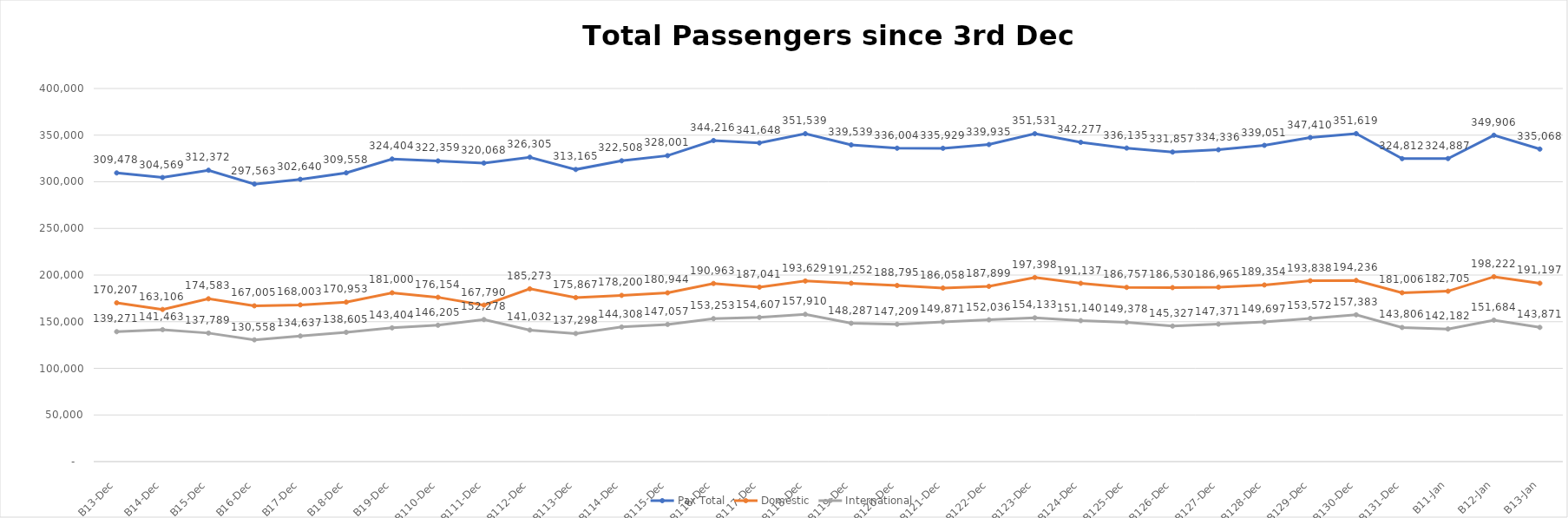
| Category | Pax Total |  Domestic  |  International  |
|---|---|---|---|
| 2022-12-03 | 309478 | 170207 | 139271 |
| 2022-12-04 | 304569 | 163106 | 141463 |
| 2022-12-05 | 312372 | 174583 | 137789 |
| 2022-12-06 | 297563 | 167005 | 130558 |
| 2022-12-07 | 302640 | 168003 | 134637 |
| 2022-12-08 | 309558 | 170953 | 138605 |
| 2022-12-09 | 324404 | 181000 | 143404 |
| 2022-12-10 | 322359 | 176154 | 146205 |
| 2022-12-11 | 320068 | 167790 | 152278 |
| 2022-12-12 | 326305 | 185273 | 141032 |
| 2022-12-13 | 313165 | 175867 | 137298 |
| 2022-12-14 | 322508 | 178200 | 144308 |
| 2022-12-15 | 328001 | 180944 | 147057 |
| 2022-12-16 | 344216 | 190963 | 153253 |
| 2022-12-17 | 341648 | 187041 | 154607 |
| 2022-12-18 | 351539 | 193629 | 157910 |
| 2022-12-19 | 339539 | 191252 | 148287 |
| 2022-12-20 | 336004 | 188795 | 147209 |
| 2022-12-21 | 335929 | 186058 | 149871 |
| 2022-12-22 | 339935 | 187899 | 152036 |
| 2022-12-23 | 351531 | 197398 | 154133 |
| 2022-12-24 | 342277 | 191137 | 151140 |
| 2022-12-25 | 336135 | 186757 | 149378 |
| 2022-12-26 | 331857 | 186530 | 145327 |
| 2022-12-27 | 334336 | 186965 | 147371 |
| 2022-12-28 | 339051 | 189354 | 149697 |
| 2022-12-29 | 347410 | 193838 | 153572 |
| 2022-12-30 | 351619 | 194236 | 157383 |
| 2022-12-31 | 324812 | 181006 | 143806 |
| 2023-01-01 | 324887 | 182705 | 142182 |
| 2023-01-02 | 349906 | 198222 | 151684 |
| 2023-01-03 | 335068 | 191197 | 143871 |